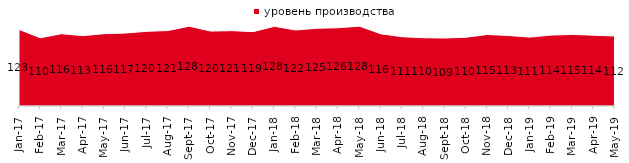
| Category | уровень производства |
|---|---|
| 2017-01-01 | 122.95 |
| 2017-02-01 | 109.5 |
| 2017-03-01 | 116 |
| 2017-04-01 | 112.9 |
| 2017-05-01 | 116.1 |
| 2017-06-01 | 117.05 |
| 2017-07-01 | 119.85 |
| 2017-08-01 | 121.1 |
| 2017-09-01 | 128.05 |
| 2017-10-01 | 120.2 |
| 2017-11-01 | 120.95 |
| 2017-12-01 | 119.35 |
| 2018-01-01 | 127.8 |
| 2018-02-01 | 121.95 |
| 2018-03-01 | 124.8 |
| 2018-04-01 | 125.6 |
| 2018-05-01 | 128.1 |
| 2018-06-01 | 115.8 |
| 2018-07-01 | 111.15 |
| 2018-08-01 | 109.55 |
| 2018-09-01 | 109.1 |
| 2018-10-01 | 110.35 |
| 2018-11-01 | 114.721 |
| 2018-12-01 | 113.1 |
| 2019-01-01 | 110.55 |
| 2019-02-01 | 113.8 |
| 2019-03-01 | 114.868 |
| 2019-04-01 | 113.663 |
| 2019-05-01 | 112.283 |